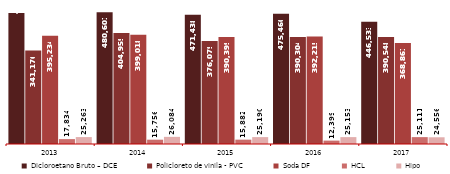
| Category | Dicloroetano Bruto – DCE | Policloreto de vinila - PVC | Soda DF | HCL | Hipo |
|---|---|---|---|---|---|
| 2013.0 | 478529.886 | 341175.758 | 395234.419 | 17834.023 | 25262.745 |
| 2014.0 | 480601.332 | 404959.409 | 399017.585 | 15755.725 | 26084.171 |
| 2015.0 | 471437.92 | 376078.95 | 390398.645 | 15882.488 | 25189.79 |
| 2016.0 | 475459.982 | 390304.437 | 392214.663 | 12398.693 | 25153.345 |
| 2017.0 | 446533.097 | 390548.39 | 368860.952 | 25111.307 | 24556.493 |